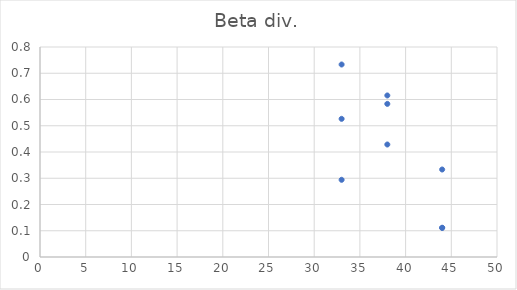
| Category | Beta div. |
|---|---|
| 44.0 | 0.111 |
| 44.0 | 0.111 |
| 44.0 | 0.333 |
| 33.0 | 0.294 |
| 33.0 | 0.526 |
| 33.0 | 0.733 |
| 38.0 | 0.429 |
| 38.0 | 0.583 |
| 38.0 | 0.615 |